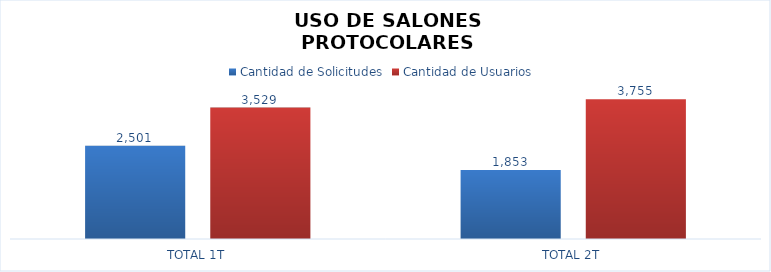
| Category | Cantidad de Solicitudes | Cantidad de Usuarios  |
|---|---|---|
| TOTAL 1T | 2501 | 3529 |
| TOTAL 2T | 1853 | 3755 |